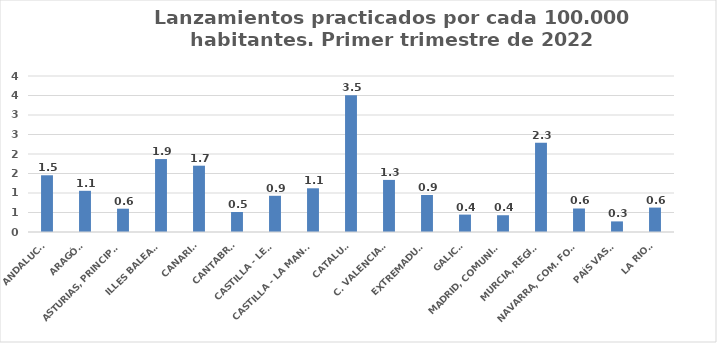
| Category | Series 0 |
|---|---|
| ANDALUCÍA | 1.455 |
| ARAGÓN | 1.056 |
| ASTURIAS, PRINCIPADO | 0.597 |
| ILLES BALEARS | 1.87 |
| CANARIAS | 1.7 |
| CANTABRIA | 0.513 |
| CASTILLA - LEÓN | 0.928 |
| CASTILLA - LA MANCHA | 1.121 |
| CATALUÑA | 3.508 |
| C. VALENCIANA | 1.336 |
| EXTREMADURA | 0.949 |
| GALICIA | 0.446 |
| MADRID, COMUNIDAD | 0.43 |
| MURCIA, REGIÓN | 2.285 |
| NAVARRA, COM. FORAL | 0.603 |
| PAÍS VASCO | 0.272 |
| LA RIOJA | 0.626 |